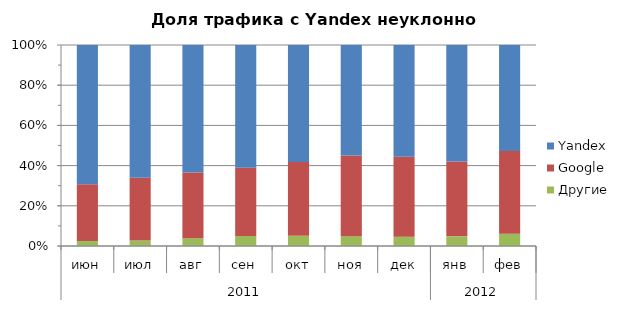
| Category | Другие | Google | Yandex |
|---|---|---|---|
| 0 | 0.025 | 0.283 | 0.692 |
| 1 | 0.027 | 0.313 | 0.66 |
| 2 | 0.039 | 0.327 | 0.634 |
| 3 | 0.05 | 0.339 | 0.611 |
| 4 | 0.051 | 0.367 | 0.582 |
| 5 | 0.049 | 0.402 | 0.55 |
| 6 | 0.047 | 0.398 | 0.556 |
| 7 | 0.048 | 0.372 | 0.58 |
| 8 | 0.061 | 0.411 | 0.528 |